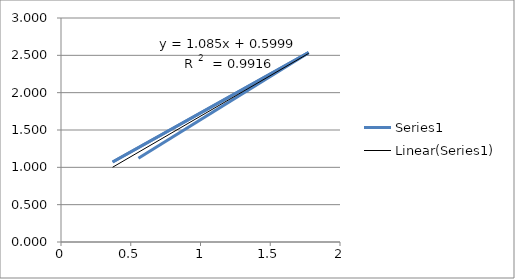
| Category | Series 0 |
|---|---|
| 0.5549999999999999 | 1.121 |
| 1.775 | 2.537 |
| 0.37 | 1.072 |